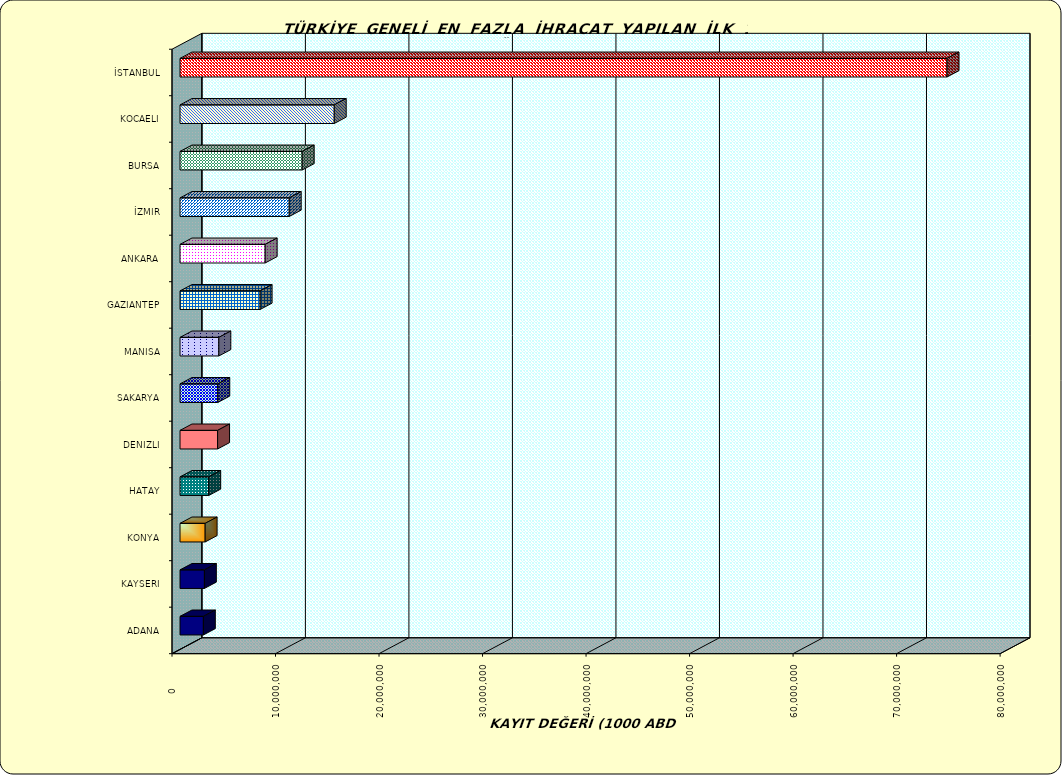
| Category | Series 0 |
|---|---|
| İSTANBUL | 74099384.625 |
| KOCAELI | 14899685.437 |
| BURSA | 11804205.759 |
| İZMIR | 10550712.885 |
| ANKARA | 8226441.859 |
| GAZIANTEP | 7739711.742 |
| MANISA | 3751568.329 |
| SAKARYA | 3647533.671 |
| DENIZLI | 3630837.002 |
| HATAY | 2773322.917 |
| KONYA | 2429126.853 |
| KAYSERI | 2355713.898 |
| ADANA | 2256584.661 |